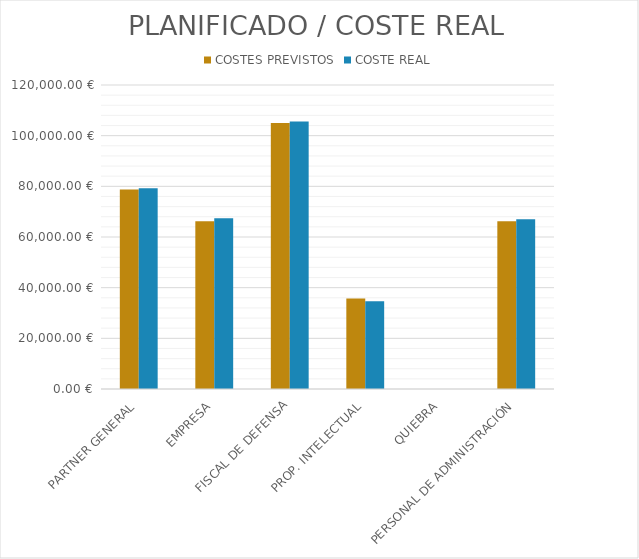
| Category | COSTES PREVISTOS | COSTE REAL |
|---|---|---|
| PARTNER GENERAL | 78750 | 79275 |
| EMPRESA | 66250 | 67375 |
| FISCAL DE DEFENSA | 105000 | 105600 |
| PROP. INTELECTUAL | 35750 | 34650 |
| QUIEBRA | 0 | 0 |
| PERSONAL DE ADMINISTRACIÓN | 66250 | 67000 |